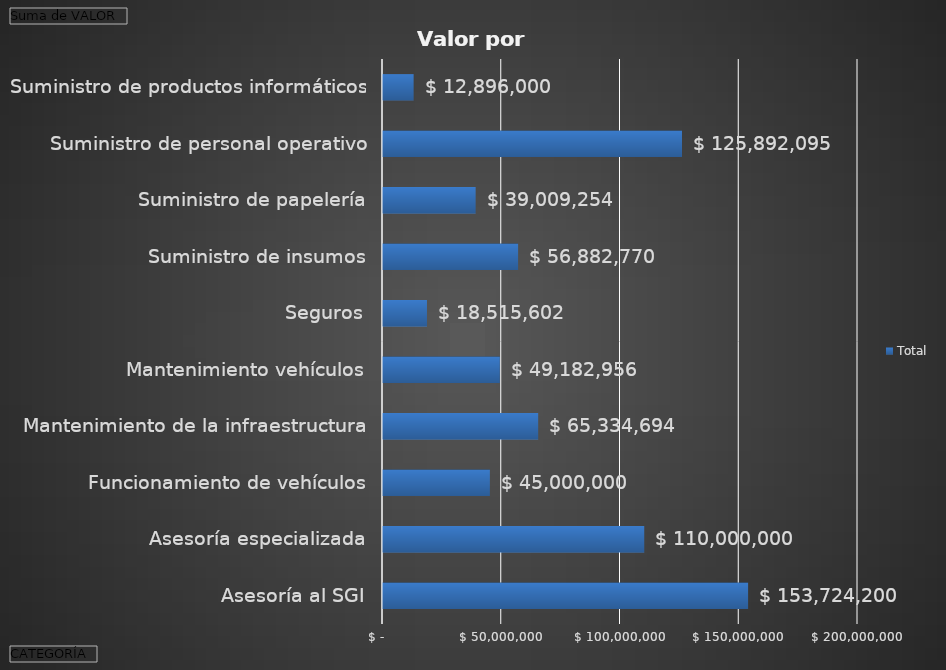
| Category | Total |
|---|---|
| Asesoría al SGI | 153724200 |
| Asesoría especializada | 110000000 |
| Funcionamiento de vehículos | 45000000 |
| Mantenimiento de la infraestructura | 65334694.39 |
| Mantenimiento vehículos | 49182956 |
| Seguros | 18515602 |
| Suministro de insumos | 56882770 |
| Suministro de papelería | 39009254 |
| Suministro de personal operativo | 125892095.37 |
| Suministro de productos informáticos | 12896000 |